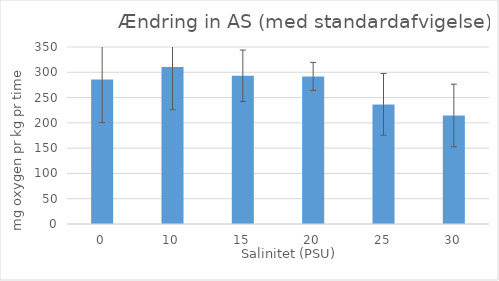
| Category | AS gennemsnit |
|---|---|
| 0.0 | 285.838 |
| 10.0 | 310.367 |
| 15.0 | 293.101 |
| 20.0 | 291.779 |
| 25.0 | 236.504 |
| 30.0 | 214.509 |